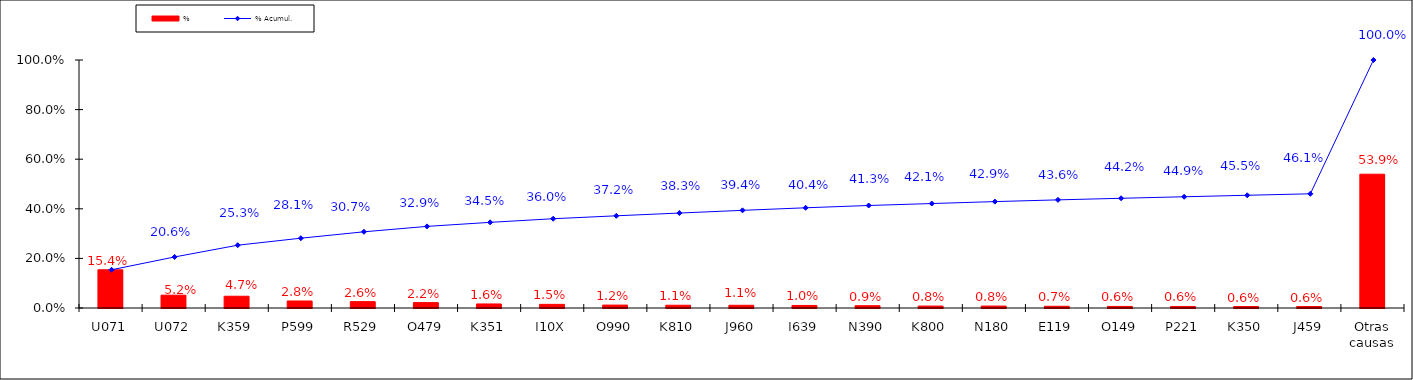
| Category | % |
|---|---|
| U071 | 0.154 |
| U072 | 0.052 |
| K359 | 0.047 |
| P599 | 0.028 |
| R529 | 0.026 |
| O479 | 0.022 |
| K351 | 0.016 |
| I10X | 0.015 |
| O990 | 0.012 |
| K810 | 0.011 |
| J960 | 0.011 |
| I639 | 0.01 |
| N390 | 0.009 |
| K800 | 0.008 |
| N180 | 0.008 |
| E119 | 0.007 |
| O149 | 0.006 |
| P221 | 0.006 |
| K350 | 0.006 |
| J459 | 0.006 |
| Otras causas | 0.539 |